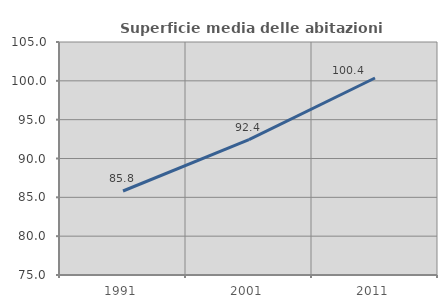
| Category | Superficie media delle abitazioni occupate |
|---|---|
| 1991.0 | 85.817 |
| 2001.0 | 92.429 |
| 2011.0 | 100.363 |